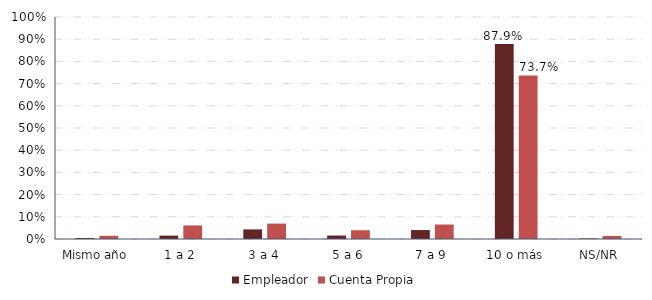
| Category | Empleador | Cuenta Propia |
|---|---|---|
| Mismo año | 0.005 | 0.014 |
| 1 a 2 | 0.015 | 0.061 |
| 3 a 4 | 0.043 | 0.069 |
| 5 a 6 | 0.016 | 0.04 |
| 7 a 9 | 0.04 | 0.065 |
| 10 o más | 0.879 | 0.737 |
| NS/NR | 0.002 | 0.014 |